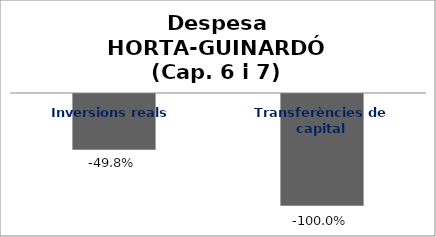
| Category | Series 0 |
|---|---|
| Inversions reals | -0.498 |
| Transferències de capital | -1 |